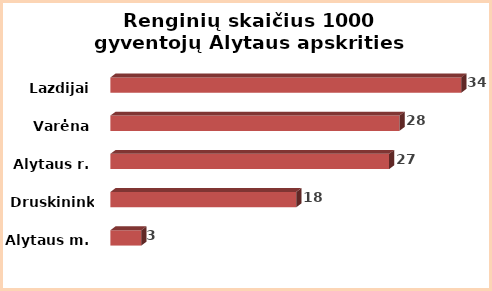
| Category | Series 0 |
|---|---|
| Alytaus m. | 3 |
| Druskininkai | 18 |
| Alytaus r. | 27 |
| Varėna | 28 |
| Lazdijai | 34 |